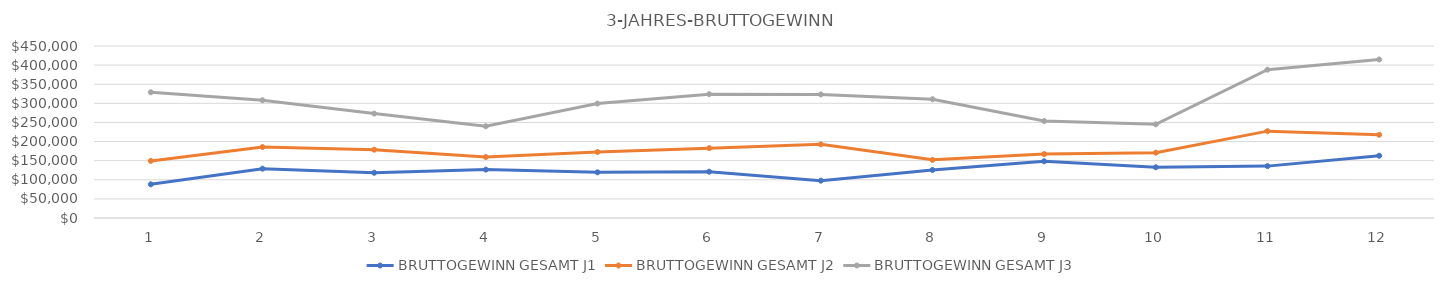
| Category | BRUTTOGEWINN GESAMT J1 | BRUTTOGEWINN GESAMT J2 | BRUTTOGEWINN GESAMT J3 |
|---|---|---|---|
| 0 | 88114 | 149299.8 | 328920.1 |
| 1 | 129087 | 185572.05 | 307938.2 |
| 2 | 118320 | 178734.75 | 273173.6 |
| 3 | 126600 | 159643.5 | 240058.1 |
| 4 | 119528 | 172671.8 | 299376.2 |
| 5 | 121091.5 | 182784.4 | 323907 |
| 6 | 97705.5 | 192648.75 | 323256.1 |
| 7 | 125637 | 152163.2 | 310748.5 |
| 8 | 148434 | 167284.6 | 253671.3 |
| 9 | 132710 | 170910.05 | 245075.1 |
| 10 | 135723 | 227271.75 | 388017.1 |
| 11 | 162928 | 217656 | 414703.8 |